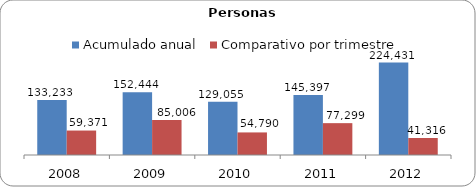
| Category | Acumulado anual | Comparativo por trimestre |
|---|---|---|
| 2008.0 | 133233 | 59371 |
| 2009.0 | 152444 | 85006 |
| 2010.0 | 129055 | 54790 |
| 2011.0 | 145397 | 77299 |
| 2012.0 | 224431 | 41316 |